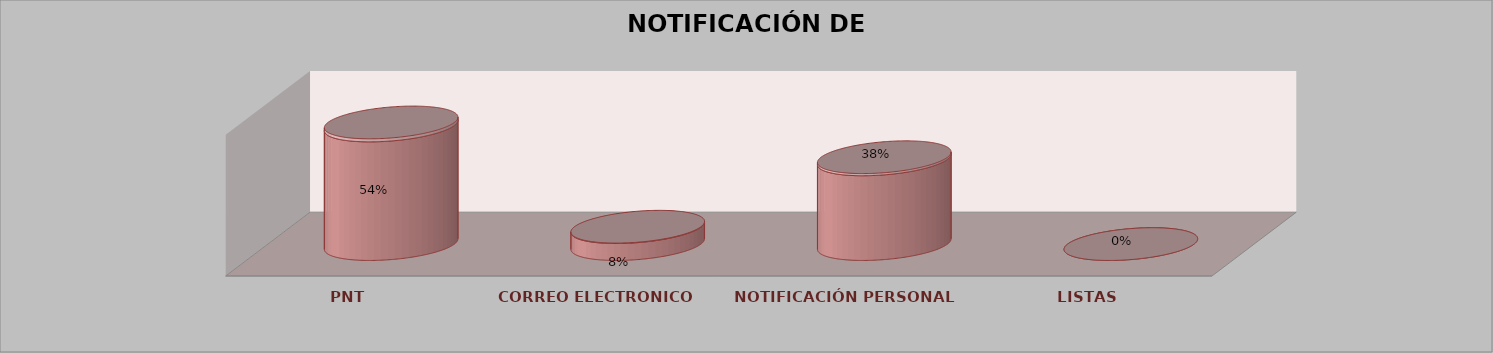
| Category | Series 0 | Series 1 | Series 2 | Series 3 | Series 4 |
|---|---|---|---|---|---|
| PNT |  |  |  | 21 | 0.538 |
| CORREO ELECTRONICO |  |  |  | 3 | 0.077 |
| NOTIFICACIÓN PERSONAL |  |  |  | 15 | 0.385 |
| LISTAS |  |  |  | 0 | 0 |